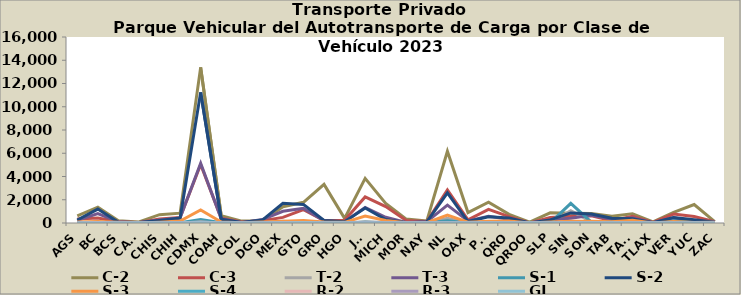
| Category | C-2 | C-3 | T-2 | T-3 | S-1 | S-2 | S-3 | S-4 | R-2 | R-3 | GI |
|---|---|---|---|---|---|---|---|---|---|---|---|
| AGS | 615 | 337 | 4 | 227 | 14 | 262 | 82 | 1 | 4 | 0 | 0 |
| BC | 1359 | 422 | 71 | 813 | 37 | 1197 | 128 | 3 | 40 | 5 | 1 |
| BCS | 192 | 108 | 3 | 97 | 1 | 62 | 72 | 0 | 1 | 7 | 1 |
| CAMP | 95 | 46 | 10 | 30 | 1 | 52 | 9 | 0 | 0 | 0 | 0 |
| CHIS | 716 | 342 | 3 | 263 | 10 | 223 | 70 | 0 | 5 | 0 | 0 |
| CHIH | 846 | 469 | 17 | 441 | 14 | 421 | 167 | 2 | 3 | 1 | 5 |
| CDMX | 13386 | 5026 | 101 | 5142 | 290 | 11236 | 1126 | 12 | 81 | 16 | 21 |
| COAH | 619 | 400 | 12 | 359 | 14 | 322 | 90 | 1 | 2 | 1 | 0 |
| COL | 165 | 80 | 8 | 30 | 9 | 34 | 25 | 0 | 2 | 1 | 0 |
| DGO | 174 | 202 | 20 | 295 | 20 | 251 | 80 | 1 | 1 | 0 | 0 |
| MEX | 1405 | 484 | 160 | 1010 | 112 | 1700 | 149 | 0 | 20 | 10 | 3 |
| GTO | 1781 | 1144 | 34 | 1258 | 45 | 1600 | 224 | 3 | 1 | 0 | 11 |
| GRO | 3320 | 208 | 0 | 199 | 0 | 220 | 84 | 0 | 4 | 0 | 2 |
| HGO | 403 | 228 | 0 | 112 | 3 | 118 | 55 | 0 | 0 | 0 | 0 |
| JAL | 3839 | 2242 | 97 | 1342 | 62 | 1294 | 595 | 3 | 7 | 11 | 1 |
| MICH | 1686 | 1416 | 33 | 490 | 27 | 300 | 222 | 1 | 7 | 4 | 1 |
| MOR | 334 | 221 | 2 | 47 | 0 | 29 | 23 | 0 | 3 | 1 | 0 |
| NAY | 174 | 133 | 0 | 118 | 4 | 94 | 30 | 0 | 0 | 0 | 0 |
| NL | 6173 | 2851 | 414 | 1540 | 191 | 2588 | 686 | 2 | 13 | 10 | 6 |
| OAX | 899 | 272 | 2 | 176 | 0 | 125 | 74 | 0 | 1 | 4 | 0 |
| PUE | 1797 | 1176 | 33 | 589 | 111 | 535 | 158 | 0 | 9 | 4 | 0 |
| QRO | 747 | 547 | 18 | 318 | 35 | 423 | 181 | 1 | 2 | 0 | 2 |
| QROO | 82 | 12 | 1 | 12 | 1 | 5 | 2 | 0 | 1 | 0 | 0 |
| SLP | 874 | 468 | 10 | 262 | 8 | 267 | 86 | 0 | 5 | 4 | 1 |
| SIN | 849 | 578 | 1066 | 415 | 1686 | 867 | 143 | 0 | 1 | 0 | 1 |
| SON | 816 | 622 | 95 | 664 | 72 | 769 | 160 | 3 | 6 | 0 | 0 |
| TAB | 574 | 195 | 4 | 313 | 97 | 406 | 103 | 3 | 1 | 0 | 0 |
| TAMS | 796 | 575 | 11 | 426 | 21 | 359 | 242 | 7 | 2 | 3 | 0 |
| TLAX | 88 | 58 | 1 | 30 | 0 | 30 | 8 | 0 | 2 | 0 | 0 |
| VER | 919 | 771 | 57 | 456 | 194 | 461 | 124 | 0 | 5 | 1 | 0 |
| YUC | 1593 | 558 | 45 | 172 | 92 | 285 | 47 | 1 | 1 | 0 | 2 |
| ZAC | 119 | 104 | 6 | 121 | 2 | 69 | 68 | 0 | 0 | 1 | 0 |